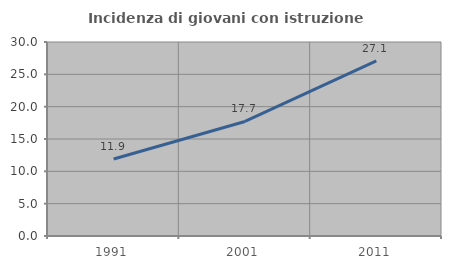
| Category | Incidenza di giovani con istruzione universitaria |
|---|---|
| 1991.0 | 11.906 |
| 2001.0 | 17.711 |
| 2011.0 | 27.081 |